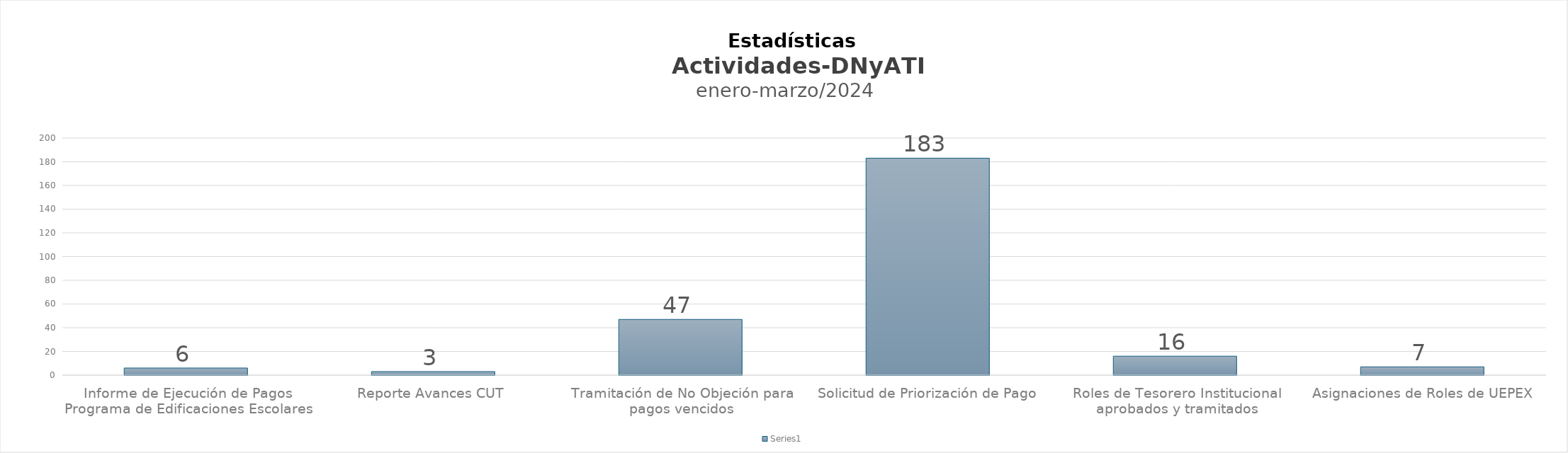
| Category | Series 0 |
|---|---|
| Informe de Ejecución de Pagos Programa de Edificaciones Escolares | 6 |
| Reporte Avances CUT  | 3 |
| Tramitación de No Objeción para pagos vencidos | 47 |
| Solicitud de Priorización de Pago | 183 |
| Roles de Tesorero Institucional aprobados y tramitados | 16 |
| Asignaciones de Roles de UEPEX | 7 |